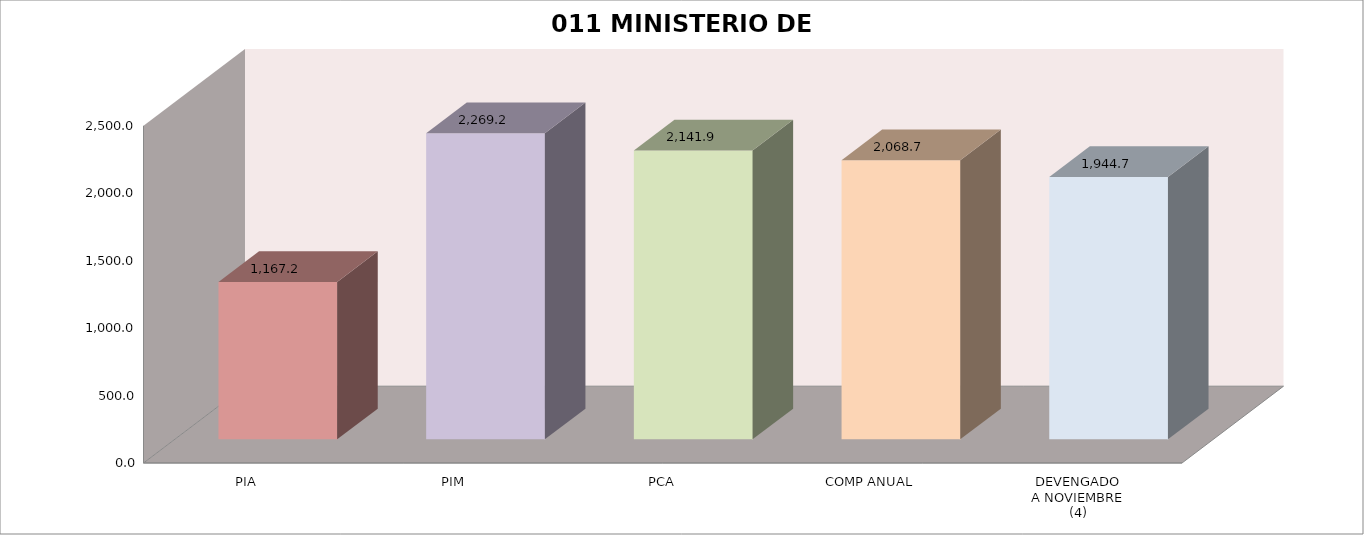
| Category | 011 MINISTERIO DE SALUD |
|---|---|
| PIA | 1167.209 |
| PIM | 2269.169 |
| PCA | 2141.932 |
| COMP ANUAL | 2068.749 |
| DEVENGADO
A NOVIEMBRE
(4) | 1944.652 |